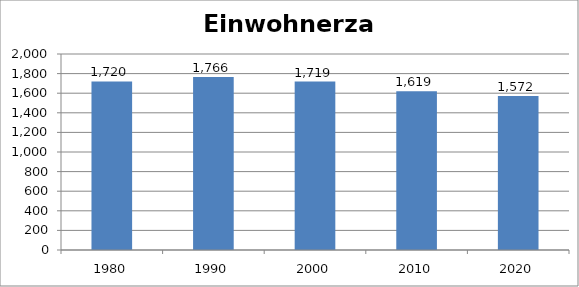
| Category | Einwohnerzahl |
|---|---|
| 1980.0 | 1720 |
| 1990.0 | 1766 |
| 2000.0 | 1719 |
| 2010.0 | 1619 |
| 2020.0 | 1572 |